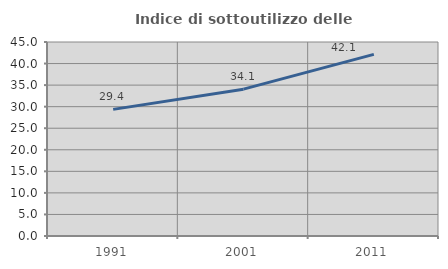
| Category | Indice di sottoutilizzo delle abitazioni  |
|---|---|
| 1991.0 | 29.372 |
| 2001.0 | 34.061 |
| 2011.0 | 42.119 |